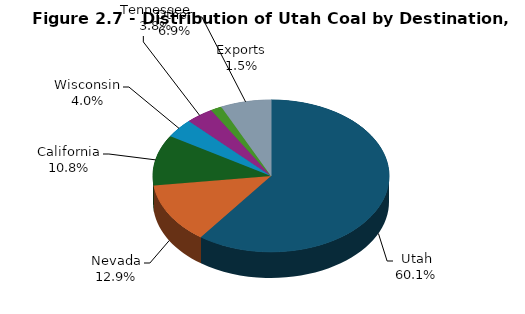
| Category | Series 0 |
|---|---|
| Utah | 13840 |
| Nevada | 2968 |
| California | 2480 |
| Wisconsin | 924 |
| Tennessee | 871 |
| Exports | 351 |
| Other | 1592 |